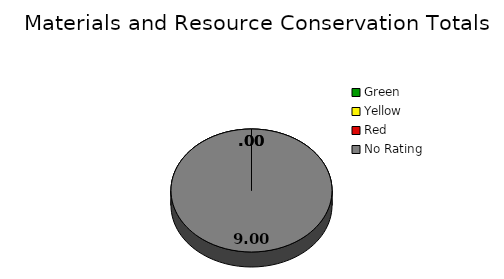
| Category | Series 0 |
|---|---|
| Green | 0 |
| Yellow | 0 |
| Red | 0 |
| No Rating | 9 |